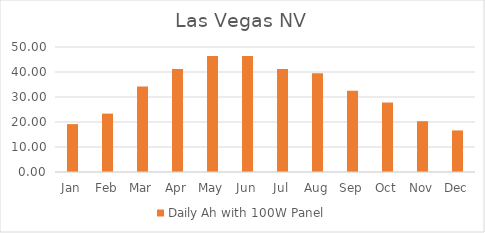
| Category | Daily Ah with 100W Panel |
|---|---|
| Jan | 19.156 |
| Feb | 23.35 |
| Mar | 34.243 |
| Apr | 41.191 |
| May | 46.402 |
| Jun | 46.402 |
| Jul | 41.191 |
| Aug | 39.454 |
| Sep | 32.506 |
| Oct | 27.792 |
| Nov | 20.323 |
| Dec | 16.625 |